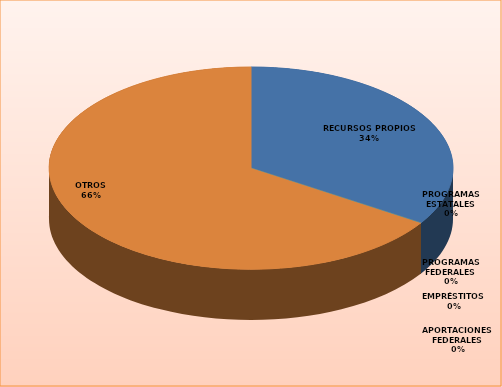
| Category | Series 0 |
|---|---|
| RECURSOS PROPIOS | 998208 |
| APORTACIONES FEDERALES | 0 |
| PROGRAMAS FEDERALES | 0 |
| PROGRAMAS ESTATALES | 0 |
| EMPRÉSTITOS | 0 |
| OTROS | 1927392 |